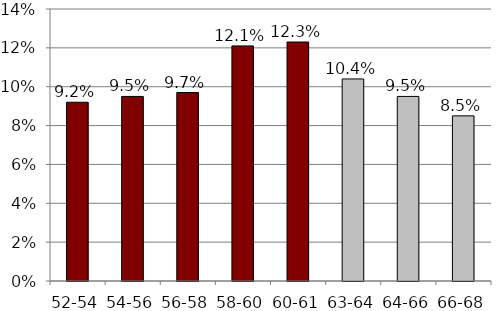
| Category | Series 0 |
|---|---|
| 52-54 | 0.092 |
| 54-56 | 0.095 |
| 56-58 | 0.097 |
| 58-60 | 0.121 |
| 60-61 | 0.123 |
| 63-64 | 0.104 |
| 64-66 | 0.095 |
| 66-68 | 0.085 |